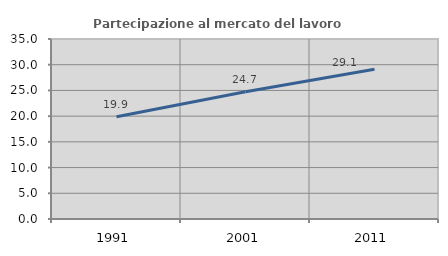
| Category | Partecipazione al mercato del lavoro  femminile |
|---|---|
| 1991.0 | 19.863 |
| 2001.0 | 24.729 |
| 2011.0 | 29.104 |